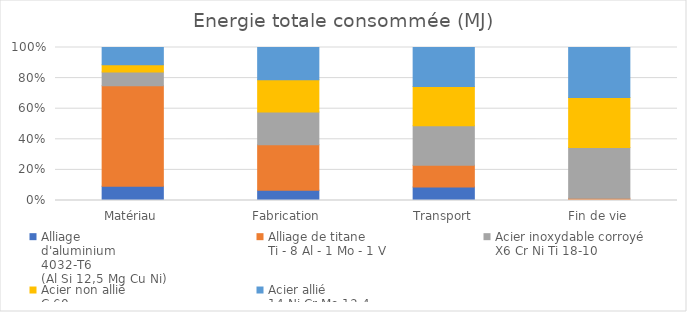
| Category | Alliage
d'aluminium
4032-T6
(Al Si 12,5 Mg Cu Ni) | Alliage de titane
Ti - 8 Al - 1 Mo - 1 V | Acier inoxydable corroyé
X6 Cr Ni Ti 18-10 | Acier non allié
C 60 | Acier allié
14 Ni Cr Mo 13-4 |
|---|---|---|---|---|---|
| Matériau | 45 | 320 | 44 | 23 | 55 |
| Fabrication | 2.5 | 11 | 7.9 | 7.8 | 7.8 |
| Transport | 0.139 | 0.226 | 0.409 | 0.404 | 0.404 |
| Fin de vie | 0.093 | 0.232 | 7.1 | 7 | 7 |